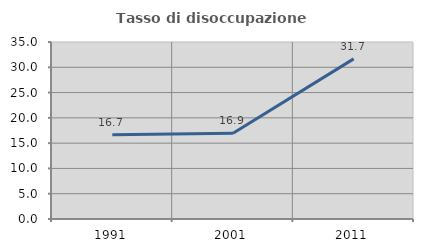
| Category | Tasso di disoccupazione giovanile  |
|---|---|
| 1991.0 | 16.667 |
| 2001.0 | 16.949 |
| 2011.0 | 31.667 |